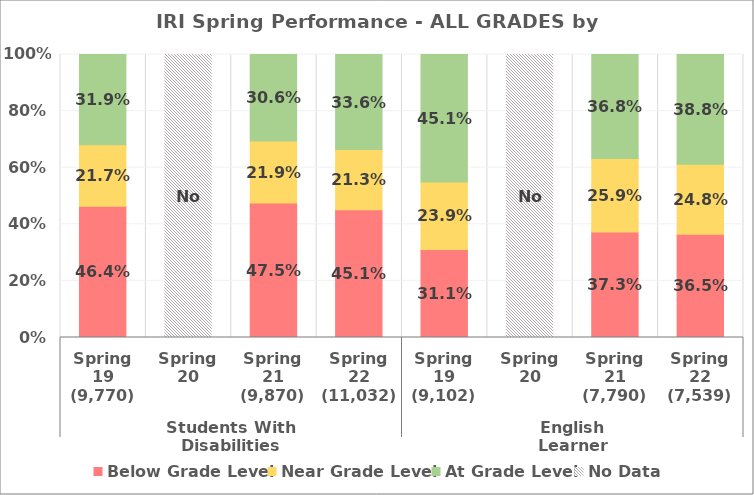
| Category | Below Grade Level | Near Grade Level | At Grade Level | No Data |
|---|---|---|---|---|
| 0 | 0.464 | 0.217 | 0.319 | 0 |
| 1 | 0 | 0 | 0 | 1 |
| 2 | 0.475 | 0.219 | 0.306 | 0 |
| 3 | 0.451 | 0.213 | 0.336 | 0 |
| 4 | 0.311 | 0.239 | 0.451 | 0 |
| 5 | 0 | 0 | 0 | 1 |
| 6 | 0.373 | 0.259 | 0.368 | 0 |
| 7 | 0.365 | 0.248 | 0.388 | 0 |